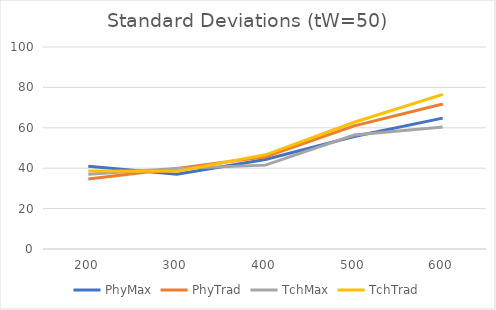
| Category | PhyMax | PhyTrad | TchMax | TchTrad |
|---|---|---|---|---|
| 200.0 | 41.016 | 34.613 | 37.052 | 38.65 |
| 300.0 | 36.957 | 39.849 | 39.87 | 38.458 |
| 400.0 | 44.337 | 45.66 | 41.52 | 46.618 |
| 500.0 | 55.699 | 60.958 | 56.418 | 62.752 |
| 600.0 | 64.78 | 71.789 | 60.454 | 76.567 |